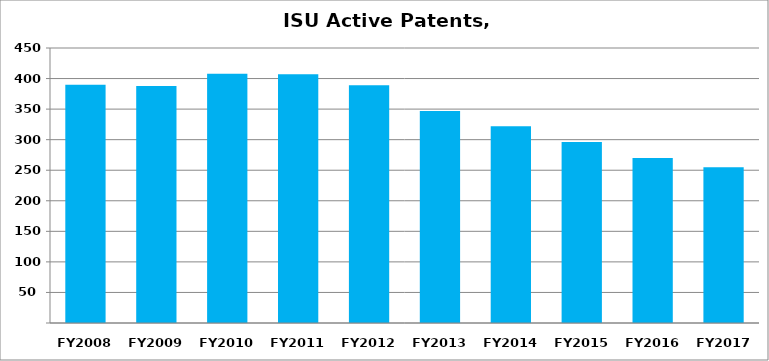
| Category | Active Patents |
|---|---|
| FY2008 | 390 |
| FY2009 | 388 |
| FY2010 | 408 |
| FY2011 | 407 |
| FY2012 | 389 |
| FY2013 | 347 |
| FY2014 | 322 |
| FY2015 | 296 |
| FY2016 | 270 |
| FY2017 | 255 |